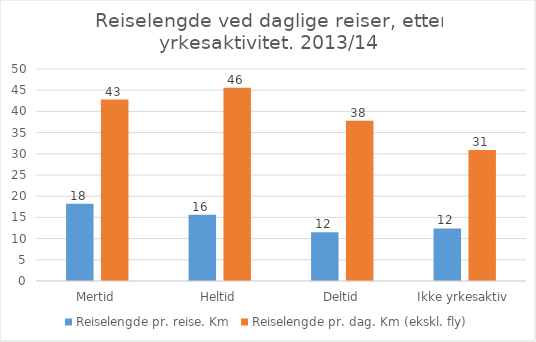
| Category | Reiselengde pr. reise. Km | Reiselengde pr. dag. Km (ekskl. fly) |
|---|---|---|
| Mertid | 18.2 | 42.8 |
| Heltid | 15.6 | 45.6 |
| Deltid | 11.5 | 37.8 |
| Ikke yrkesaktiv | 12.4 | 30.9 |